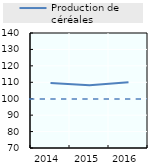
| Category | Production de céréales |
|---|---|
| 2014.0 | 109.494 |
| 2015.0 | 108.141 |
| 2016.0 | 110.011 |